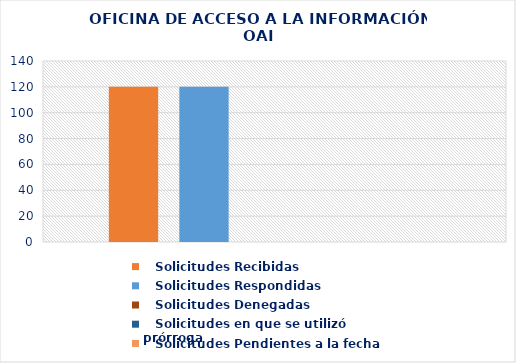
| Category |    Solicitudes Recibidas |    Solicitudes Respondidas |    Solicitudes Denegadas |    Solicitudes en que se utilizó prórroga |    Solicitudes Pendientes a la fecha |
|---|---|---|---|---|---|
| 0 | 120 | 120 | 0 | 0 | 0 |